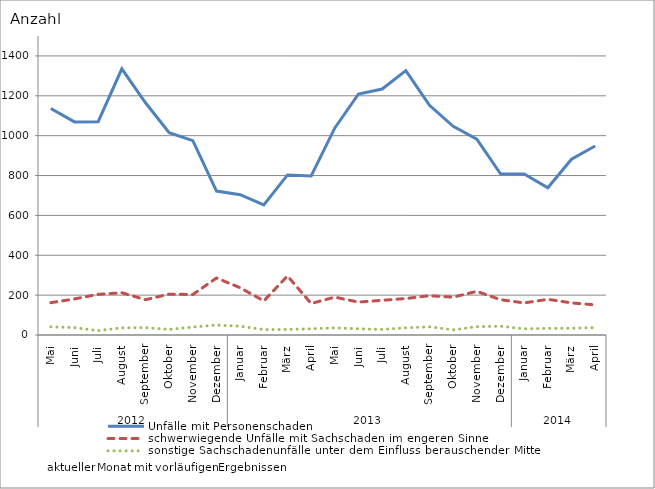
| Category | Unfälle mit Personenschaden | schwerwiegende Unfälle mit Sachschaden im engeren Sinne | sonstige Sachschadenunfälle unter dem Einfluss berauschender Mittel |
|---|---|---|---|
| 0 | 1136 | 162 | 41 |
| 1 | 1069 | 181 | 37 |
| 2 | 1070 | 204 | 22 |
| 3 | 1335 | 212 | 36 |
| 4 | 1165 | 177 | 37 |
| 5 | 1015 | 205 | 28 |
| 6 | 975 | 203 | 40 |
| 7 | 722 | 286 | 50 |
| 8 | 704 | 237 | 44 |
| 9 | 653 | 171 | 27 |
| 10 | 803 | 296 | 28 |
| 11 | 798 | 158 | 31 |
| 12 | 1039 | 190 | 36 |
| 13 | 1209 | 165 | 31 |
| 14 | 1234 | 174 | 28 |
| 15 | 1326 | 183 | 36 |
| 16 | 1152 | 197 | 41 |
| 17 | 1047 | 190 | 26 |
| 18 | 983 | 219 | 42 |
| 19 | 809 | 177 | 44 |
| 20 | 808 | 161 | 31 |
| 21 | 739 | 179 | 33 |
| 22 | 882 | 161 | 34 |
| 23 | 948 | 151 | 37 |